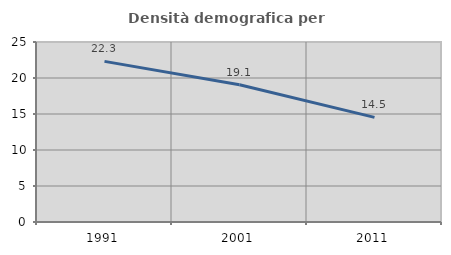
| Category | Densità demografica |
|---|---|
| 1991.0 | 22.31 |
| 2001.0 | 19.055 |
| 2011.0 | 14.536 |